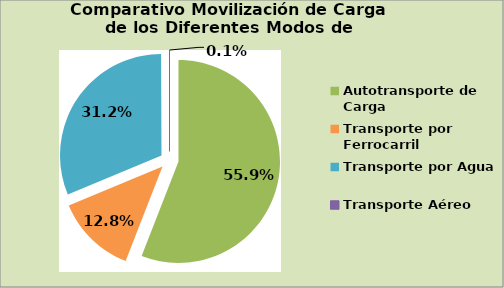
| Category | Series 0 |
|---|---|
| Autotransporte de Carga | 55.887 |
| Transporte por Ferrocarril | 12.792 |
| Transporte por Agua | 31.2 |
| Transporte Aéreo | 0.067 |